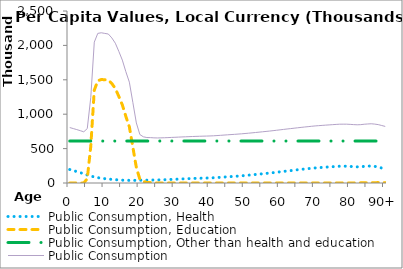
| Category | Public Consumption, Health | Public Consumption, Education | Public Consumption, Other than health and education | Public Consumption |
|---|---|---|---|---|
| 0 | 195867.454 | 0 | 610097.509 | 805964.963 |
|  | 181082.888 | 0 | 610097.509 | 791180.396 |
| 2 | 166298.321 | 0 | 610097.509 | 776395.83 |
| 3 | 150491.358 | 0 | 610097.509 | 760588.867 |
| 4 | 133750.358 | 0 | 610097.509 | 743847.867 |
| 5 | 116957.086 | 64156.155 | 610097.509 | 791210.75 |
| 6 | 100922.7 | 534427.511 | 610097.509 | 1245447.72 |
| 7 | 87995.321 | 1349090.03 | 610097.509 | 2047182.86 |
| 8 | 77732.658 | 1486770.699 | 610097.509 | 2174600.866 |
| 9 | 69485.082 | 1504009.829 | 610097.509 | 2183592.42 |
| 10 | 63156.59 | 1500863.329 | 610097.509 | 2174117.427 |
| 11 | 57413.386 | 1497990.813 | 610097.509 | 2165501.708 |
| 12 | 52511.094 | 1446098.176 | 610097.509 | 2108706.778 |
| 13 | 48112.748 | 1373871.948 | 610097.509 | 2032082.204 |
| 14 | 44431.833 | 1258164.702 | 610097.509 | 1912694.043 |
| 15 | 41349.62 | 1134835.6 | 610097.509 | 1786282.729 |
| 16 | 39394.769 | 968969.645 | 610097.509 | 1618461.923 |
| 17 | 38462.32 | 817381.328 | 610097.509 | 1465941.156 |
| 18 | 38400.975 | 522382.394 | 610097.509 | 1170880.878 |
| 19 | 38834.245 | 224468.559 | 610097.509 | 873400.313 |
| 20 | 39734.68 | 54308.126 | 610097.509 | 704140.315 |
| 21 | 40937.175 | 20464.995 | 610097.509 | 671499.679 |
| 22 | 41731.555 | 9020.048 | 610097.509 | 660849.111 |
| 23 | 42532.174 | 7169.333 | 610097.509 | 659799.016 |
| 24 | 43403.625 | 2805.614 | 610097.509 | 656306.748 |
| 25 | 44621.506 | 53.816 | 610097.509 | 654772.83 |
| 26 | 45788.288 | 304.736 | 610097.509 | 656190.533 |
| 27 | 47605.182 | 70.683 | 610097.509 | 657773.375 |
| 28 | 49730.913 | 91.82 | 610097.509 | 659920.242 |
| 29 | 52111.342 | 252.806 | 610097.509 | 662461.657 |
| 30 | 54231.348 | 73.624 | 610097.509 | 664402.481 |
| 31 | 56735.519 | 74.804 | 610097.509 | 666907.832 |
| 32 | 59147.69 | 76.087 | 610097.509 | 669321.286 |
| 33 | 61227.858 | 77.487 | 610097.509 | 671402.854 |
| 34 | 63422.098 | 79.012 | 610097.509 | 673598.619 |
| 35 | 65570.094 | 80.65 | 610097.509 | 675748.253 |
| 36 | 67425.364 | 82.399 | 610097.509 | 677605.272 |
| 37 | 68905.5 | 84.354 | 610097.509 | 679087.363 |
| 38 | 70612.071 | 86.575 | 610097.509 | 680796.155 |
| 39 | 71987.718 | 89.042 | 610097.509 | 682174.269 |
| 40 | 73824.063 | 91.715 | 610097.509 | 684013.287 |
| 41 | 76033.182 | 94.659 | 610097.509 | 686225.35 |
| 42 | 79084.629 | 97.689 | 610097.509 | 689279.827 |
| 43 | 82514.168 | 100.684 | 610097.509 | 692712.361 |
| 44 | 86379.324 | 103.748 | 610097.509 | 696580.582 |
| 45 | 90064.181 | 107.088 | 610097.509 | 700268.778 |
| 46 | 93644.459 | 110.616 | 610097.509 | 703852.584 |
| 47 | 96902.099 | 114.834 | 610097.509 | 707114.442 |
| 48 | 100800.033 | 120.139 | 610097.509 | 711017.681 |
| 49 | 104679.827 | 126.461 | 610097.509 | 714903.797 |
| 50 | 109115.955 | 133.265 | 610097.509 | 719346.728 |
| 51 | 113777.062 | 140.659 | 610097.509 | 724015.23 |
| 52 | 118756.543 | 148.712 | 610097.509 | 729002.764 |
| 53 | 123746.434 | 157.349 | 610097.509 | 734001.292 |
| 54 | 128832.994 | 166.509 | 610097.509 | 739097.012 |
| 55 | 133995.561 | 176.541 | 610097.509 | 744269.611 |
| 56 | 139275.893 | 187.837 | 610097.509 | 749561.239 |
| 57 | 144570.245 | 197.857 | 610097.509 | 754865.611 |
| 58 | 150487.928 | 204.651 | 610097.509 | 760790.088 |
| 59 | 156354.988 | 208.942 | 610097.509 | 766661.439 |
| 60 | 162331.024 | 213.373 | 610097.509 | 772641.906 |
| 61 | 168526.143 | 217.397 | 610097.509 | 778841.049 |
| 62 | 174720.398 | 222.443 | 610097.509 | 785040.35 |
| 63 | 180420.162 | 229.816 | 610097.509 | 790747.487 |
| 64 | 186274.368 | 239.245 | 610097.509 | 796611.122 |
| 65 | 192121.164 | 248.833 | 610097.509 | 802467.505 |
| 66 | 197832.698 | 258.81 | 610097.509 | 808189.017 |
| 67 | 203559.397 | 271.256 | 610097.509 | 813928.162 |
| 68 | 208791.855 | 287.564 | 610097.509 | 819176.928 |
| 69 | 214125.997 | 307.936 | 610097.509 | 824531.442 |
| 70 | 219042.73 | 331.37 | 610097.509 | 829471.609 |
| 71 | 223182.895 | 358.974 | 610097.509 | 833639.378 |
| 72 | 226840.938 | 391.021 | 610097.509 | 837329.467 |
| 73 | 230487.514 | 427.61 | 610097.509 | 841012.633 |
| 74 | 233905.708 | 470.052 | 610097.509 | 844473.268 |
| 75 | 237452.403 | 521.377 | 610097.509 | 848071.289 |
| 76 | 240922.727 | 583.647 | 610097.509 | 851603.883 |
| 77 | 243977.956 | 660.292 | 610097.509 | 854735.757 |
| 78 | 244164.017 | 756.505 | 610097.509 | 855018.032 |
| 79 | 243995.806 | 878.906 | 610097.509 | 854972.221 |
| 80 | 240889.434 | 1038.464 | 610097.509 | 852025.407 |
| 81 | 237162.994 | 1256.176 | 610097.509 | 848516.68 |
| 82 | 234561.199 | 1535.951 | 610097.509 | 846194.659 |
| 83 | 236228.449 | 1870.636 | 610097.509 | 848196.594 |
| 84 | 241731.263 | 2269.923 | 610097.509 | 854098.695 |
| 85 | 244899.599 | 2815.908 | 610097.509 | 857813.016 |
| 86 | 247208.537 | 3574.358 | 610097.509 | 860880.404 |
| 87 | 241412.921 | 4617.828 | 610097.509 | 856128.258 |
| 88 | 232419.692 | 6072.721 | 610097.509 | 848589.921 |
| 89 | 217509.046 | 8140.257 | 610097.509 | 835746.812 |
| 90+ | 208426.326 | 3609.155 | 610097.509 | 822132.99 |